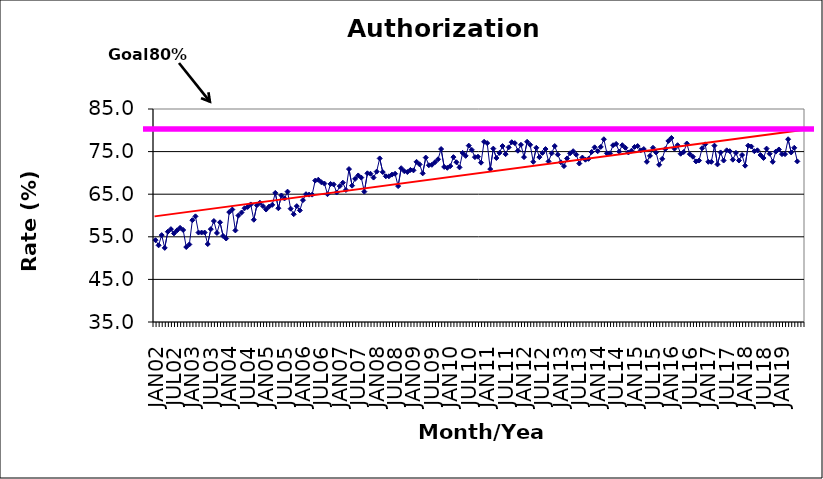
| Category | Series 0 |
|---|---|
| JAN02 | 54.2 |
| FEB02 | 53 |
| MAR02 | 55.4 |
| APR02 | 52.4 |
| MAY02 | 56.2 |
| JUN02 | 56.8 |
| JUL02 | 55.8 |
| AUG02 | 56.5 |
| SEP02 | 57.1 |
| OCT02 | 56.6 |
| NOV02 | 52.6 |
| DEC02 | 53.2 |
| JAN03 | 58.9 |
| FEB03 | 59.8 |
| MAR03 | 56 |
| APR03 | 56 |
| MAY03 | 56 |
| JUN03 | 53.3 |
| JUL03 | 56.8 |
| AUG03 | 58.7 |
| SEP03 | 55.9 |
| OCT03 | 58.4 |
| NOV03 | 55.2 |
| DEC03 | 54.6 |
| JAN04 | 60.8 |
| FEB04 | 61.4 |
| MAR04 | 56.5 |
| APR04 | 60 |
| MAY04 | 60.7 |
| JUN04 | 61.7 |
| JUL04 | 62 |
| AUG04 | 62.6 |
| SEP04 | 59 |
| OCT04 | 62.4 |
| NOV04 | 63 |
| DEC04 | 62.2 |
| JAN05 | 61.4 |
| FEB05 | 62.1 |
| MAR05 | 62.5 |
| APR05 | 65.3 |
| MAY05 | 61.7 |
| JUN05 | 64.7 |
| JUL05 | 64 |
| AUG05 | 65.6 |
| SEP05 | 61.6 |
| OCT05 | 60.3 |
| NOV05 | 62.2 |
| DEC05 | 61.2 |
| JAN06 | 63.6 |
| FEB06 | 65 |
| MAR06 | 64.9 |
| APR06 | 64.9 |
| MAY06 | 68.2 |
| JUN06 | 68.4 |
| JUL06 | 67.8 |
| AUG06 | 67.5 |
| SEP06 | 65 |
| OCT06 | 67.4 |
| NOV06 | 67.3 |
| DEC06 | 65.4 |
| JAN07 | 66.9 |
| FEB07 | 67.7 |
| MAR07 | 66 |
| APR07 | 70.9 |
| MAY07 | 67 |
| JUN07 | 68.6 |
| JUL07 | 69.4 |
| AUG07 | 68.9 |
| SEP07 | 65.6 |
| OCT07 | 69.9 |
| NOV07 | 69.8 |
| DEC07 | 68.9 |
| JAN08 | 70.3 |
| FEB08 | 73.4 |
| MAR08 | 70.2 |
| APR08 | 69.2 |
| MAY08 | 69.2 |
| JUN08 | 69.6 |
| JUL08 | 69.8 |
| AUG08 | 66.9 |
| SEP08 | 71.1 |
| OCT08 | 70.4 |
| NOV08 | 70.2 |
| DEC08 | 70.7 |
| JAN09 | 70.6 |
| FEB09 | 72.6 |
| MAR09 | 72 |
| APR09 | 69.9 |
| MAY09 | 73.6 |
| JUN09 | 71.8 |
| JUL09 | 71.9 |
| AUG09 | 72.5 |
| SEP09 | 73.2 |
| OCT09 | 75.6 |
| NOV09 | 71.4 |
| DEC09 | 71.2 |
| JAN10 | 71.6 |
| FEB10 | 73.7 |
| MAR10 | 72.5 |
| APR10 | 71.3 |
| MAY10 | 74.7 |
| JUN10 | 74 |
| JUL10 | 76.4 |
| AUG10 | 75.4 |
| SEP10 | 73.7 |
| OCT10 | 73.8 |
| NOV10 | 72.4 |
| DEC10 | 77.3 |
| JAN11 | 77 |
| FEB11 | 70.9 |
| MAR11 | 75.7 |
| APR11 | 73.5 |
| MAY11 | 74.7 |
| JUN11 | 76.3 |
| JUL11 | 74.4 |
| AUG11 | 76 |
| SEP11 | 77.2 |
| OCT11 | 77 |
| NOV11 | 75.2 |
| DEC11 | 76.6 |
| JAN12 | 73.7 |
| FEB12 | 77.3 |
| MAR12 | 76.6 |
| APR12 | 72.6 |
| MAY12 | 75.9 |
| JUN12 | 73.7 |
| JUL12 | 74.7 |
| AUG12 | 75.6 |
| SEP12 | 72.7 |
| OCT12 | 74.6 |
| NOV12 | 76.3 |
| DEC12 | 74.3 |
| JAN13 | 72.5 |
| FEB13 | 71.6 |
| MAR13 | 73.4 |
| APR13 | 74.6 |
| MAY13 | 75.1 |
| JUN13 | 74.3 |
| JUL13 | 72.2 |
| AUG13 | 73.6 |
| SEP13 | 73.1 |
| OCT13 | 73.3 |
| NOV13 | 74.9 |
| DEC13 | 76 |
| JAN14 | 75.1 |
| FEB14 | 76.1 |
| MAR14 | 77.9 |
| APR14 | 74.6 |
| MAY14 | 74.6 |
| JUN14 | 76.5 |
| JUL14 | 76.8 |
| AUG14 | 75 |
| SEP14 | 76.5 |
| OCT14 | 75.9 |
| NOV14 | 74.8 |
| DEC14 | 75.2 |
| JAN15 | 76.1 |
| FEB15 | 76.3 |
| MAR15 | 75.3 |
| APR15 | 75.6 |
| MAY15 | 72.6 |
| JUN15 | 74 |
| JUL15 | 75.9 |
| AUG15 | 74.8 |
| SEP15 | 71.9 |
| OCT15 | 73.3 |
| NOV15 | 75.6 |
| DEC15 | 77.5 |
| JAN16 | 78.2 |
| FEB16 | 75.7 |
| MAR16 | 76.5 |
| APR16 | 74.5 |
| MAY16 | 74.9 |
| JUN16 | 76.9 |
| JUL16 | 74.4 |
| AUG16 | 73.8 |
| SEP16 | 72.7 |
| OCT16 | 72.9 |
| NOV16 | 75.8 |
| DEC16 | 76.7 |
| JAN17 | 72.6 |
| FEB17 | 72.6 |
| MAR17 | 76.4 |
| APR17 | 72 |
| MAY17 | 74.8 |
| JUN17 | 72.9 |
| JUL17 | 75.3 |
| AUG17 | 75.1 |
| SEP17 | 73.1 |
| OCT17 | 74.7 |
| NOV17 | 72.9 |
| DEC17 | 74.2 |
| JAN18 | 71.7 |
| FEB18 | 76.4 |
| MAR18 | 76.2 |
| APR18 | 75.1 |
| MAY18 | 75.3 |
| JUN18 | 74.2 |
| JUL18 | 73.5 |
| AUG18 | 75.7 |
| SEP18 | 74.5 |
| OCT18 | 72.6 |
| NOV18 | 75 |
| DEC18 | 75.5 |
| JAN19 | 74.4 |
| FEB19 | 74.4 |
| MAR19 | 77.9 |
| APR19 | 74.8 |
| MAY19 | 75.9 |
| JUN19 | 72.7 |